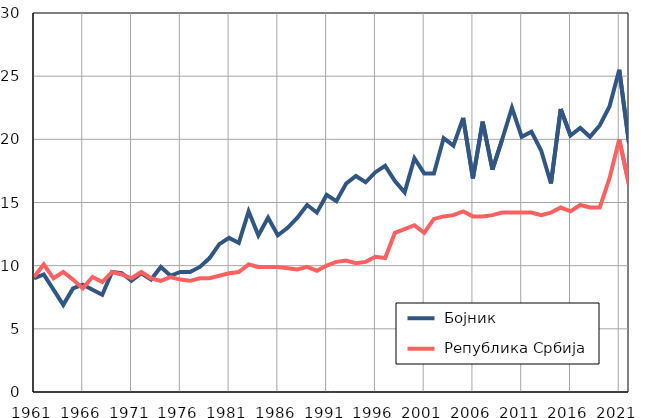
| Category |  Бојник |  Република Србија |
|---|---|---|
| 1961.0 | 9 | 9.1 |
| 1962.0 | 9.3 | 10.1 |
| 1963.0 | 8.1 | 9 |
| 1964.0 | 6.9 | 9.5 |
| 1965.0 | 8.2 | 8.9 |
| 1966.0 | 8.5 | 8.2 |
| 1967.0 | 8.1 | 9.1 |
| 1968.0 | 7.7 | 8.7 |
| 1969.0 | 9.5 | 9.5 |
| 1970.0 | 9.4 | 9.3 |
| 1971.0 | 8.8 | 9 |
| 1972.0 | 9.4 | 9.5 |
| 1973.0 | 8.9 | 9 |
| 1974.0 | 9.9 | 8.8 |
| 1975.0 | 9.2 | 9.1 |
| 1976.0 | 9.5 | 8.9 |
| 1977.0 | 9.5 | 8.8 |
| 1978.0 | 9.9 | 9 |
| 1979.0 | 10.6 | 9 |
| 1980.0 | 11.7 | 9.2 |
| 1981.0 | 12.2 | 9.4 |
| 1982.0 | 11.8 | 9.5 |
| 1983.0 | 14.3 | 10.1 |
| 1984.0 | 12.4 | 9.9 |
| 1985.0 | 13.8 | 9.9 |
| 1986.0 | 12.4 | 9.9 |
| 1987.0 | 13 | 9.8 |
| 1988.0 | 13.8 | 9.7 |
| 1989.0 | 14.8 | 9.9 |
| 1990.0 | 14.2 | 9.6 |
| 1991.0 | 15.6 | 10 |
| 1992.0 | 15.1 | 10.3 |
| 1993.0 | 16.5 | 10.4 |
| 1994.0 | 17.1 | 10.2 |
| 1995.0 | 16.6 | 10.3 |
| 1996.0 | 17.4 | 10.7 |
| 1997.0 | 17.9 | 10.6 |
| 1998.0 | 16.7 | 12.6 |
| 1999.0 | 15.8 | 12.9 |
| 2000.0 | 18.5 | 13.2 |
| 2001.0 | 17.3 | 12.6 |
| 2002.0 | 17.3 | 13.7 |
| 2003.0 | 20.1 | 13.9 |
| 2004.0 | 19.5 | 14 |
| 2005.0 | 21.7 | 14.3 |
| 2006.0 | 16.9 | 13.9 |
| 2007.0 | 21.4 | 13.9 |
| 2008.0 | 17.6 | 14 |
| 2009.0 | 20 | 14.2 |
| 2010.0 | 22.5 | 14.2 |
| 2011.0 | 20.2 | 14.2 |
| 2012.0 | 20.6 | 14.2 |
| 2013.0 | 19.1 | 14 |
| 2014.0 | 16.5 | 14.2 |
| 2015.0 | 22.4 | 14.6 |
| 2016.0 | 20.3 | 14.3 |
| 2017.0 | 20.9 | 14.8 |
| 2018.0 | 20.2 | 14.6 |
| 2019.0 | 21.1 | 14.6 |
| 2020.0 | 22.6 | 16.9 |
| 2021.0 | 25.5 | 20 |
| 2022.0 | 19.7 | 16.4 |